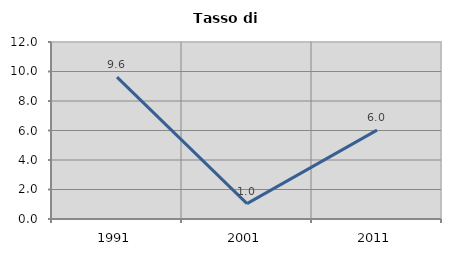
| Category | Tasso di disoccupazione   |
|---|---|
| 1991.0 | 9.615 |
| 2001.0 | 1.042 |
| 2011.0 | 6.024 |